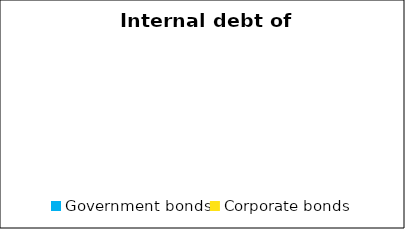
| Category | Domestic bond market volume |
|---|---|
| Government bonds | 0 |
| Corporate bonds | 0 |